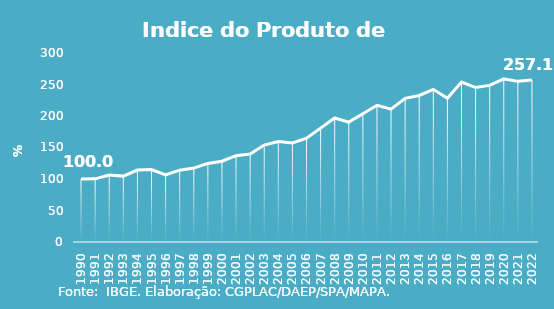
| Category | Indice de Prod. base 1990 |
|---|---|
| 1990.0 | 100 |
| 1991.0 | 100.275 |
| 1992.0 | 106.203 |
| 1993.0 | 104.57 |
| 1994.0 | 114.164 |
| 1995.0 | 115.024 |
| 1996.0 | 106.552 |
| 1997.0 | 114.037 |
| 1998.0 | 117.319 |
| 1999.0 | 124.734 |
| 2000.0 | 128.293 |
| 2001.0 | 136.975 |
| 2002.0 | 139.51 |
| 2003.0 | 153.868 |
| 2004.0 | 159.641 |
| 2005.0 | 157.136 |
| 2006.0 | 164.858 |
| 2007.0 | 180.781 |
| 2008.0 | 196.91 |
| 2009.0 | 190.309 |
| 2010.0 | 203.581 |
| 2011.0 | 217.041 |
| 2012.0 | 210.932 |
| 2013.0 | 228.009 |
| 2014.0 | 232.562 |
| 2015.0 | 242.318 |
| 2016.0 | 228.239 |
| 2017.0 | 253.826 |
| 2018.0 | 245.134 |
| 2019.0 | 248.619 |
| 2020.0 | 258.848 |
| 2021.0 | 254.988 |
| 2022.0 | 257.075 |